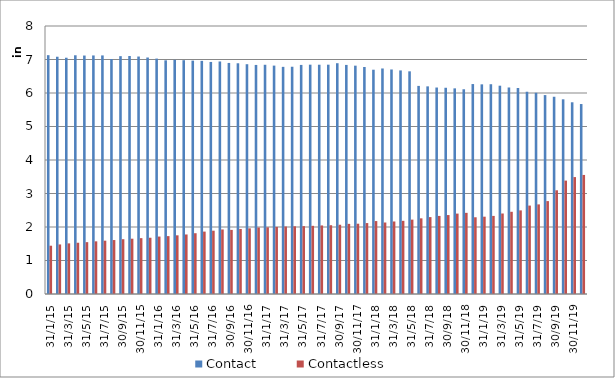
| Category | Contact | Contactless |
|---|---|---|
| 2015-01-31 | 7129150 | 1441434 |
| 2015-02-28 | 7082417 | 1479374 |
| 2015-03-31 | 7053142 | 1511330 |
| 2015-04-30 | 7126252 | 1529942 |
| 2015-05-31 | 7118286 | 1547834 |
| 2015-06-30 | 7120959 | 1572061 |
| 2015-07-31 | 7121885 | 1591850 |
| 2015-08-31 | 7014148 | 1610587 |
| 2015-09-30 | 7099818 | 1635957 |
| 2015-10-31 | 7103946 | 1650752 |
| 2015-11-30 | 7088873 | 1667219 |
| 2015-12-31 | 7059590 | 1679403 |
| 2016-01-31 | 7027213 | 1714950 |
| 2016-02-29 | 6975506 | 1727887 |
| 2016-03-31 | 6989930 | 1751512 |
| 2016-04-30 | 6979564 | 1776886 |
| 2016-05-31 | 6966648 | 1814233 |
| 2016-06-30 | 6959395 | 1862700 |
| 2016-07-31 | 6927310 | 1889925 |
| 2016-08-31 | 6941145 | 1926289 |
| 2016-09-30 | 6897213 | 1914070 |
| 2016-10-31 | 6887436 | 1941595 |
| 2016-11-30 | 6859426 | 1959545 |
| 2016-12-31 | 6837748 | 1985072 |
| 2017-01-31 | 6842786 | 1990487 |
| 2017-02-28 | 6817679 | 2002822 |
| 2017-03-31 | 6780498 | 2014680 |
| 2017-04-30 | 6783872 | 2020822 |
| 2017-05-31 | 6838182 | 2025505 |
| 2017-06-30 | 6845606 | 2035069 |
| 2017-07-31 | 6844238 | 2046570 |
| 2017-08-31 | 6845404 | 2053495 |
| 2017-09-30 | 6889221 | 2067311 |
| 2017-10-31 | 6838214 | 2093973 |
| 2017-11-30 | 6815969 | 2098074 |
| 2017-12-31 | 6776918 | 2117254 |
| 2018-01-31 | 6695007 | 2177083 |
| 2018-02-28 | 6732187 | 2134191 |
| 2018-03-31 | 6702216 | 2164648 |
| 2018-04-30 | 6673956 | 2184149 |
| 2018-05-31 | 6646975 | 2220210 |
| 2018-06-30 | 6211850 | 2258657 |
| 2018-07-31 | 6198225 | 2295510 |
| 2018-08-31 | 6163333 | 2330615 |
| 2018-09-30 | 6156225 | 2356518 |
| 2018-10-31 | 6138559 | 2400133 |
| 2018-11-30 | 6111800 | 2422586 |
| 2018-12-31 | 6267109 | 2290474 |
| 2019-01-31 | 6258361 | 2307838 |
| 2019-02-28 | 6262083 | 2331039 |
| 2019-03-31 | 6218082 | 2403112 |
| 2019-04-30 | 6164493 | 2454122 |
| 2019-05-31 | 6149460 | 2496287 |
| 2019-06-30 | 6037684 | 2639589 |
| 2019-07-31 | 6006840 | 2674818 |
| 2019-08-31 | 5937719 | 2773117 |
| 2019-09-30 | 5887780 | 3095912 |
| 2019-10-31 | 5811685 | 3384890 |
| 2019-11-30 | 5723018 | 3489993 |
| 2019-12-31 | 5670701 | 3554151 |